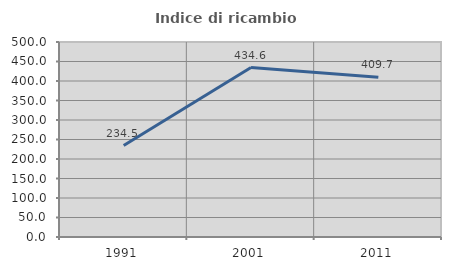
| Category | Indice di ricambio occupazionale  |
|---|---|
| 1991.0 | 234.483 |
| 2001.0 | 434.615 |
| 2011.0 | 409.677 |